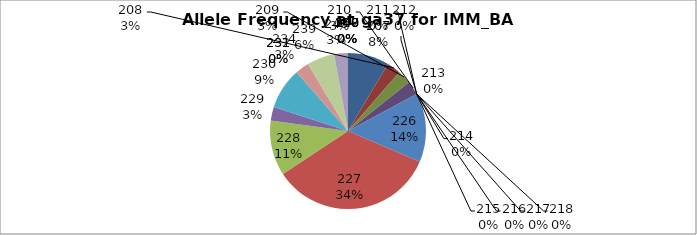
| Category | Series 0 |
|---|---|
| 207.0 | 0.086 |
| 208.0 | 0.029 |
| 209.0 | 0.029 |
| 210.0 | 0.029 |
| 211.0 | 0 |
| 212.0 | 0 |
| 213.0 | 0 |
| 214.0 | 0 |
| 215.0 | 0 |
| 216.0 | 0 |
| 217.0 | 0 |
| 218.0 | 0 |
| 226.0 | 0.143 |
| 227.0 | 0.343 |
| 228.0 | 0.114 |
| 229.0 | 0.029 |
| 230.0 | 0.086 |
| 231.0 | 0 |
| 232.0 | 0 |
| 234.0 | 0.029 |
| 239.0 | 0.057 |
| 240.0 | 0.029 |
| 247.0 | 0 |
| 248.0 | 0 |
| 249.0 | 0 |
| 250.0 | 0 |